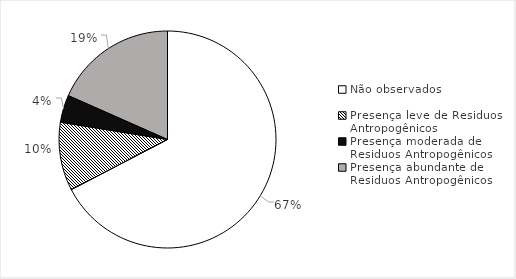
| Category | N° de indíviduos |
|---|---|
| Não observados | 33 |
| Presença leve de Residuos Antropogênicos | 5 |
| Presença moderada de Residuos Antropogênicos | 2 |
| Presença abundante de Residuos Antropogênicos | 9 |